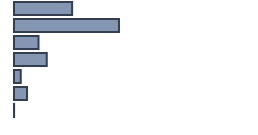
| Category | Percentatge |
|---|---|
| 0 | 24.217 |
| 1 | 43.739 |
| 2 | 10.174 |
| 3 | 13.652 |
| 4 | 2.783 |
| 5 | 5.391 |
| 6 | 0.043 |